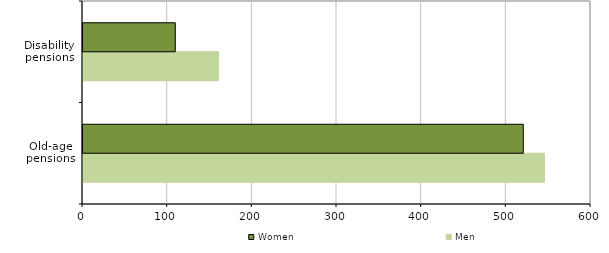
| Category | Men | Women |
|---|---|---|
| Old-age
pensions | 545 | 520 |
| Disability pensions | 160 | 109 |